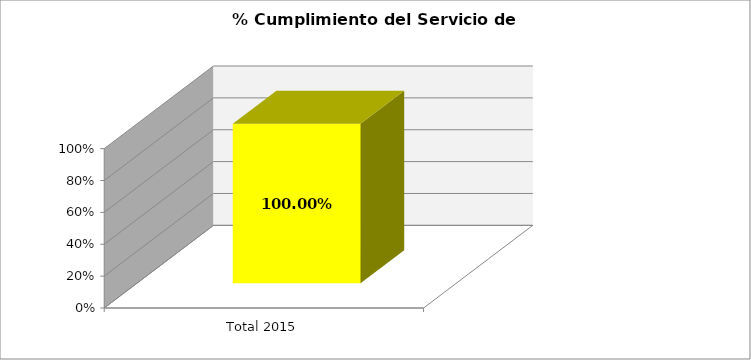
| Category | % |
|---|---|
| Total 2015 | 1 |